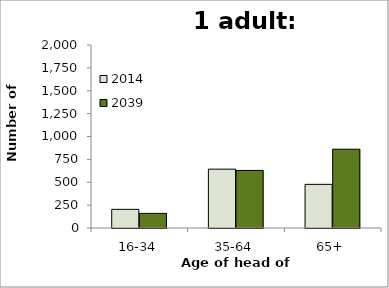
| Category | 2014 | 2039 |
|---|---|---|
| 16-34 | 204 | 160 |
| 35-64 | 643 | 629 |
| 65+ | 477 | 861 |